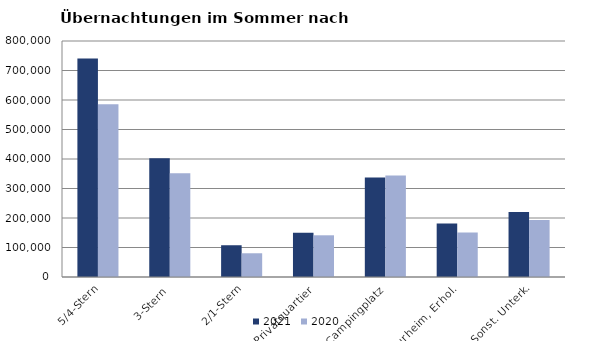
| Category | 2021 | 2020 |
|---|---|---|
| 5/4-Stern | 740802 | 585947 |
| 3-Stern | 402715 | 351679 |
| 2/1-Stern | 107662 | 80461 |
| Privatquartier | 149588 | 141353 |
| Campingplatz | 337089 | 343986 |
| Kurheim, Erhol. | 181656 | 151108 |
| Sonst. Unterk. | 220684 | 192799 |